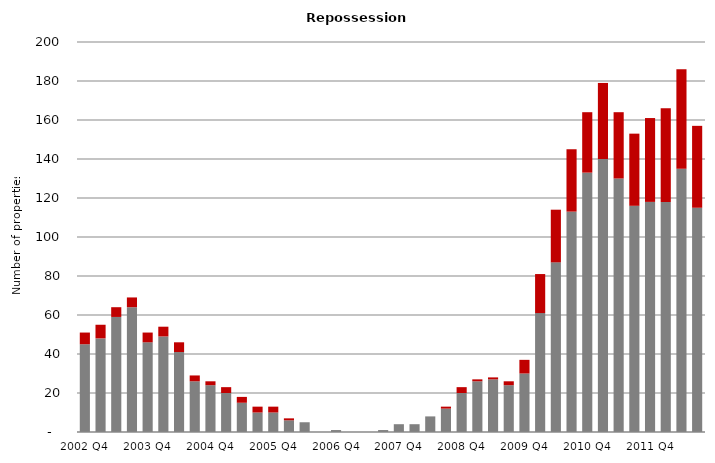
| Category | Homeowner Segment | Corporate Segments |
|---|---|---|
| 2002 Q4 | 45 | 6 |
| 2003 Q1 | 48 | 7 |
| 2003 Q2 | 59 | 5 |
| 2003 Q3 | 64 | 5 |
| 2003 Q4 | 46 | 5 |
| 2004 Q1 | 49 | 5 |
| 2004 Q2 | 41 | 5 |
| 2004 Q3 | 26 | 3 |
| 2004 Q4 | 24 | 2 |
| 2005 Q1 | 20 | 3 |
| 2005 Q2 | 15 | 3 |
| 2005 Q3 | 10 | 3 |
| 2005 Q4 | 10 | 3 |
| 2006 Q1 | 6 | 1 |
| 2006 Q2 | 5 | 0 |
| 2006 Q3 | 0 | 0 |
| 2006 Q4 | 1 | 0 |
| 2007 Q1 | 0 | 0 |
| 2007 Q2 | 0 | 0 |
| 2007 Q3 | 1 | 0 |
| 2007 Q4 | 4 | 0 |
| 2008 Q1 | 4 | 0 |
| 2008 Q2 | 8 | 0 |
| 2008 Q3 | 12 | 1 |
| 2008 Q4 | 20 | 3 |
| 2009 Q1 | 26 | 1 |
| 2009 Q2 | 27 | 1 |
| 2009 Q3 | 24 | 2 |
| 2009 Q4 | 30 | 7 |
| 2010 Q1 | 61 | 20 |
| 2010 Q2 | 87 | 27 |
| 2010 Q3 | 113 | 32 |
| 2010 Q4 | 133 | 31 |
| 2011 Q1 | 140 | 39 |
| 2011 Q2 | 130 | 34 |
| 2011 Q3 | 116 | 37 |
| 2011 Q4 | 118 | 43 |
| 2012 Q1 | 118 | 48 |
| 2012 Q2 | 135 | 51 |
| 2012 Q3 | 115 | 42 |